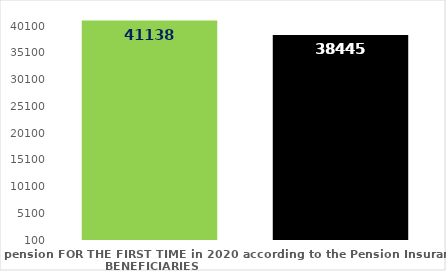
| Category | broj korisnika |
|---|---|
| Pension beneficiaries entitled to pension FOR THE FIRST TIME in 2020 according to the Pension Insurance Act  - NEW BENEFICIARIES | 41138 |
| Pension beneficiaries whose pension entitlement ceased in 2020  -  death caused,   
and who were retired according to the Pension Insurance Act   | 38445 |